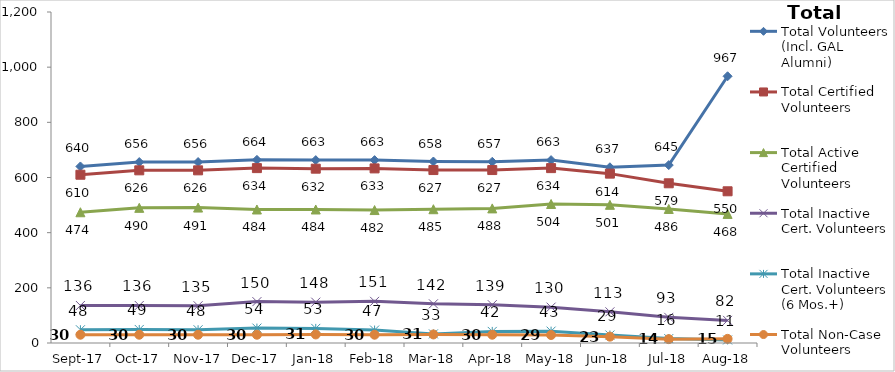
| Category | Total Volunteers (Incl. GAL Alumni) | Total Certified Volunteers | Total Active Certified Volunteers | Total Inactive Cert. Volunteers | Total Inactive Cert. Volunteers (6 Mos.+) | Total Non-Case Volunteers |
|---|---|---|---|---|---|---|
| 2017-09-01 | 640 | 610 | 474 | 136 | 48 | 30 |
| 2017-10-01 | 656 | 626 | 490 | 136 | 49 | 30 |
| 2017-11-01 | 656 | 626 | 491 | 135 | 48 | 30 |
| 2017-12-01 | 664 | 634 | 484 | 150 | 54 | 30 |
| 2018-01-01 | 663 | 632 | 484 | 148 | 53 | 31 |
| 2018-02-01 | 663 | 633 | 482 | 151 | 47 | 30 |
| 2018-03-01 | 658 | 627 | 485 | 142 | 33 | 31 |
| 2018-04-01 | 657 | 627 | 488 | 139 | 42 | 30 |
| 2018-05-01 | 663 | 634 | 504 | 130 | 43 | 29 |
| 2018-06-01 | 637 | 614 | 501 | 113 | 29 | 23 |
| 2018-07-01 | 645 | 579 | 486 | 93 | 16 | 14 |
| 2018-08-01 | 967 | 550 | 468 | 82 | 11 | 15 |